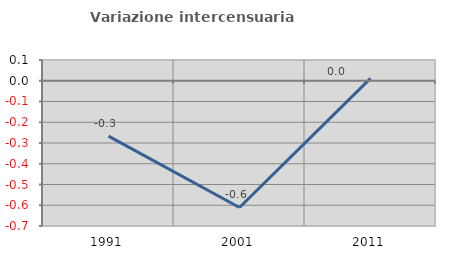
| Category | Variazione intercensuaria annua |
|---|---|
| 1991.0 | -0.267 |
| 2001.0 | -0.611 |
| 2011.0 | 0.012 |